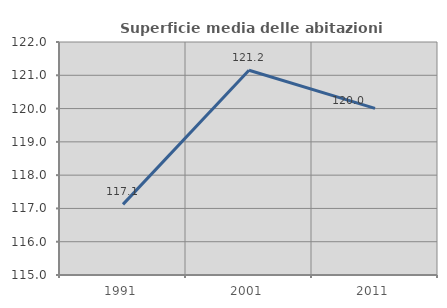
| Category | Superficie media delle abitazioni occupate |
|---|---|
| 1991.0 | 117.122 |
| 2001.0 | 121.151 |
| 2011.0 | 120.006 |